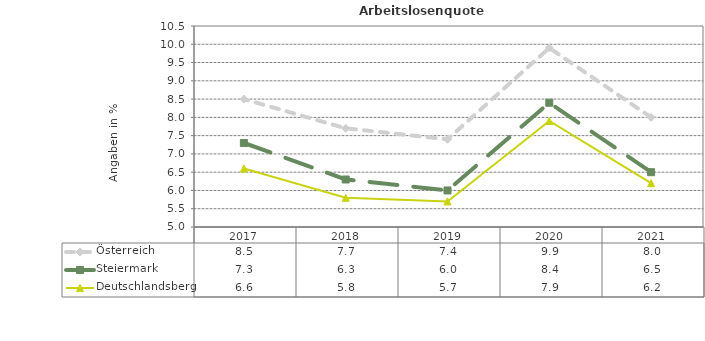
| Category | Österreich | Steiermark | Deutschlandsberg |
|---|---|---|---|
| 2021.0 | 8 | 6.5 | 6.2 |
| 2020.0 | 9.9 | 8.4 | 7.9 |
| 2019.0 | 7.4 | 6 | 5.7 |
| 2018.0 | 7.7 | 6.3 | 5.8 |
| 2017.0 | 8.5 | 7.3 | 6.6 |